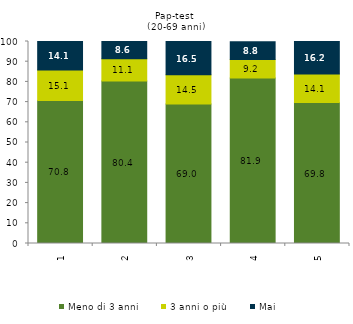
| Category | Meno di 3 anni | 3 anni o più | Mai |
|---|---|---|---|
| 0 | 70.8 | 15.1 | 14.1 |
| 1 | 80.4 | 11.1 | 8.6 |
| 2 | 69 | 14.5 | 16.5 |
| 3 | 81.9 | 9.2 | 8.8 |
| 4 | 69.8 | 14.1 | 16.2 |